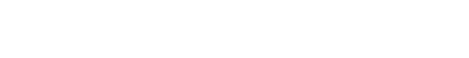
| Category | Series 3 | Series 4 | NA | oui | non |
|---|---|---|---|---|---|
| 0 | 0 | 0 | 0 | 0 | 0 |